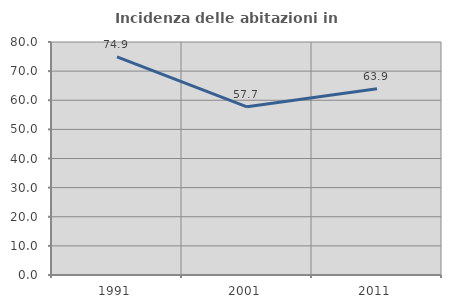
| Category | Incidenza delle abitazioni in proprietà  |
|---|---|
| 1991.0 | 74.925 |
| 2001.0 | 57.743 |
| 2011.0 | 63.942 |